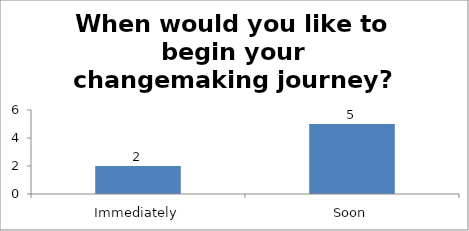
| Category | When would you like to begin your changemaking journey?  |
|---|---|
| Immediately | 2 |
| Soon | 5 |